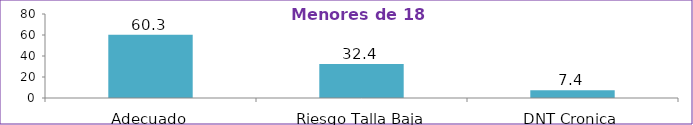
| Category | Series 0 |
|---|---|
| Adecuado | 60.3 |
| Riesgo Talla Baja | 32.4 |
| DNT Cronica | 7.4 |